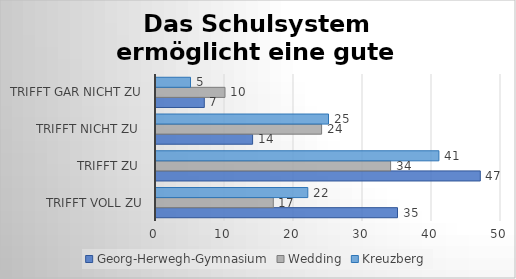
| Category | Georg-Herwegh-Gymnasium | Wedding | Kreuzberg |
|---|---|---|---|
| trifft voll zu | 35 | 17 | 22 |
| trifft zu  | 47 | 34 | 41 |
| trifft nicht zu  | 14 | 24 | 25 |
| trifft gar nicht zu | 7 | 10 | 5 |